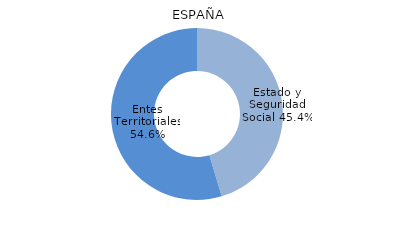
| Category | Series 0 |
|---|---|
| Estado y Seguridad Social | 3503655.631 |
| Entes Territoriales | 4220793.247 |